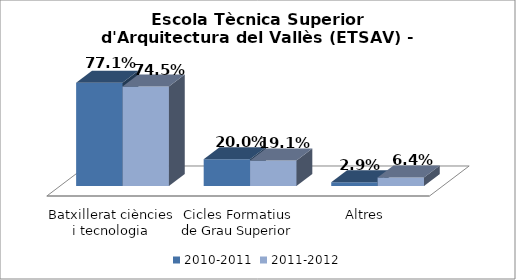
| Category | 2010-2011 | 2011-2012 |
|---|---|---|
| Batxillerat ciències i tecnologia | 0.771 | 0.745 |
| Cicles Formatius de Grau Superior | 0.2 | 0.191 |
| Altres | 0.029 | 0.064 |